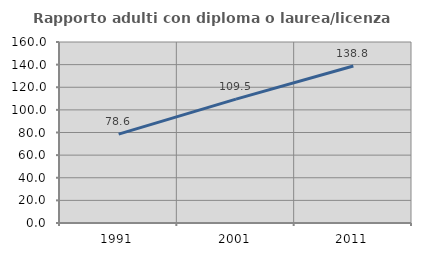
| Category | Rapporto adulti con diploma o laurea/licenza media  |
|---|---|
| 1991.0 | 78.579 |
| 2001.0 | 109.47 |
| 2011.0 | 138.801 |